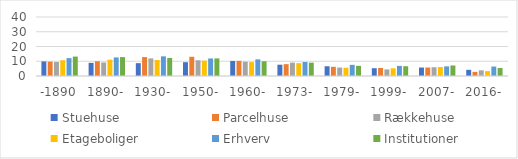
| Category | Stuehuse | Parcelhuse | Rækkehuse | Etageboliger | Erhverv | Institutioner |
|---|---|---|---|---|---|---|
| -1890 | 9.884 | 9.736 | 9.486 | 10.646 | 12.121 | 13.165 |
| 1890- | 8.928 | 10.008 | 9.185 | 11.062 | 12.585 | 12.816 |
| 1930- | 8.711 | 12.835 | 11.94 | 10.883 | 13.341 | 12.222 |
| 1950- | 9.356 | 13.03 | 10.664 | 10.418 | 11.878 | 11.927 |
| 1960- | 10.212 | 10.261 | 9.675 | 9.411 | 11.271 | 10 |
| 1973- | 7.66 | 8.02 | 9.083 | 8.706 | 9.497 | 9.062 |
| 1979- | 6.612 | 6.237 | 5.717 | 5.611 | 7.555 | 6.882 |
| 1999- | 5.276 | 5.455 | 4.461 | 5.187 | 6.856 | 6.619 |
| 2007- | 5.737 | 5.762 | 5.946 | 6.095 | 6.537 | 7.116 |
| 2016- | 4.181 | 2.801 | 3.845 | 3.315 | 6.406 | 5.404 |